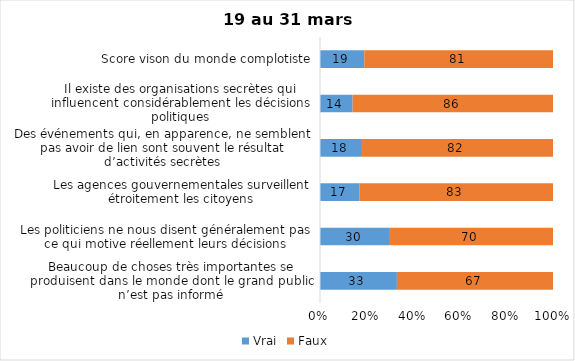
| Category | Vrai | Faux |
|---|---|---|
| Beaucoup de choses très importantes se produisent dans le monde dont le grand public n’est pas informé | 33 | 67 |
| Les politiciens ne nous disent généralement pas ce qui motive réellement leurs décisions | 30 | 70 |
| Les agences gouvernementales surveillent étroitement les citoyens | 17 | 83 |
| Des événements qui, en apparence, ne semblent pas avoir de lien sont souvent le résultat d’activités secrètes | 18 | 82 |
| Il existe des organisations secrètes qui influencent considérablement les décisions politiques | 14 | 86 |
| Score vison du monde complotiste | 19 | 81 |